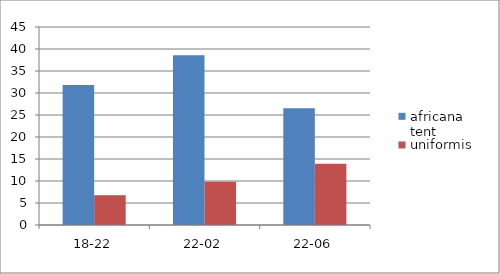
| Category | africana tent | uniformis tent |
|---|---|---|
| 18-22 | 31.819 | 6.769 |
| 22-02 | 38.562 | 9.838 |
| 22-06 | 26.533 | 13.945 |